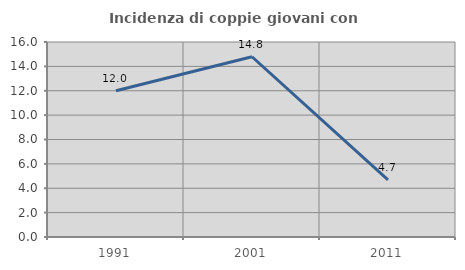
| Category | Incidenza di coppie giovani con figli |
|---|---|
| 1991.0 | 12 |
| 2001.0 | 14.789 |
| 2011.0 | 4.688 |